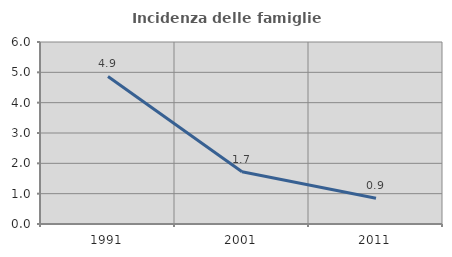
| Category | Incidenza delle famiglie numerose |
|---|---|
| 1991.0 | 4.865 |
| 2001.0 | 1.724 |
| 2011.0 | 0.852 |